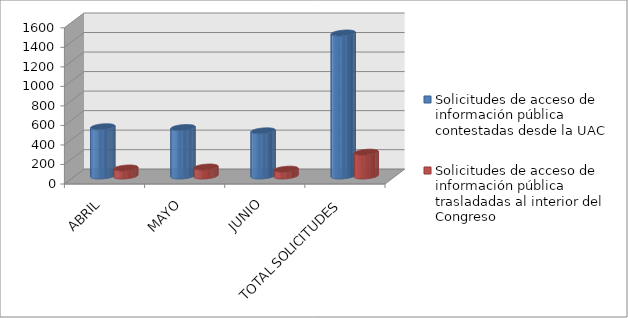
| Category | Solicitudes de acceso de información pública contestadas desde la UAC | Solicitudes de acceso de información pública trasladadas al interior del Congreso |
|---|---|---|
| ABRIL | 505 | 82 |
| MAYO | 497 | 92 |
| JUNIO | 463 | 70 |
| TOTAL SOLICITUDES | 1465 | 244 |